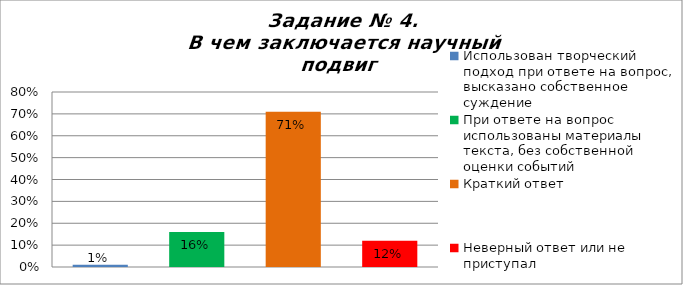
| Category | В чем заключается научный подвиг Н.И. Лобачевского? |
|---|---|
| Использован творческий подход при ответе на вопрос, высказано собственное суждение | 0.01 |
| При ответе на вопрос использованы материалы текста, без собственной оценки событий | 0.16 |
| Краткий ответ | 0.71 |
| Неверный ответ или не приступал | 0.12 |